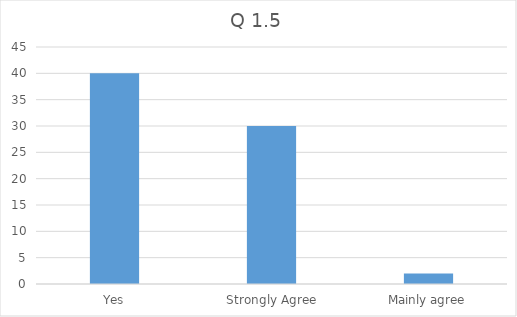
| Category | Total |
|---|---|
| Yes, Strongly Agree | 40 |
| Mainly agree | 30 |
| Mainly disagree | 2 |